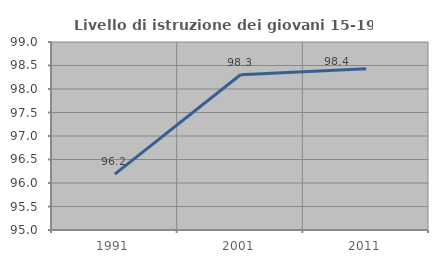
| Category | Livello di istruzione dei giovani 15-19 anni |
|---|---|
| 1991.0 | 96.19 |
| 2001.0 | 98.303 |
| 2011.0 | 98.431 |